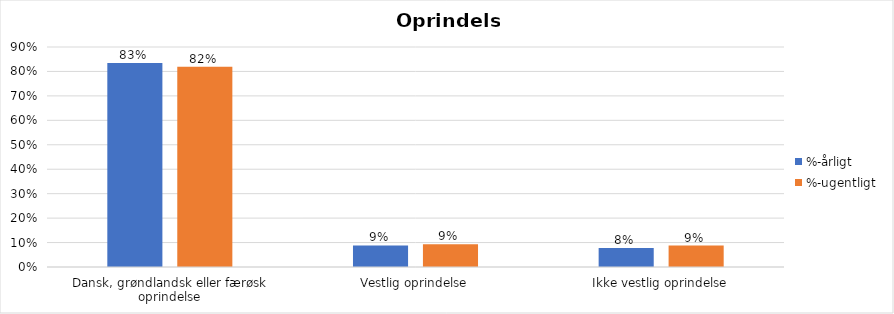
| Category | %-årligt | %-ugentligt |
|---|---|---|
| Dansk, grøndlandsk eller færøsk oprindelse | 0.834 | 0.819 |
| Vestlig oprindelse | 0.088 | 0.093 |
| Ikke vestlig oprindelse | 0.078 | 0.088 |